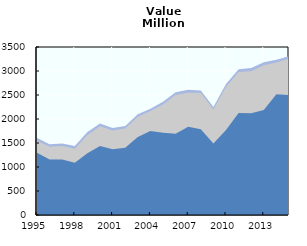
| Category | Inland fisheries | Aquaculture | Marine landings |
|---|---|---|---|
| 1995.0 | 1604.711 | 1547.007 | 1297.856 |
| 1996.0 | 1476.109 | 1424.082 | 1158.258 |
| 1997.0 | 1490.675 | 1438.333 | 1155.212 |
| 1998.0 | 1438.422 | 1380.849 | 1086.364 |
| 1999.0 | 1727.395 | 1668.109 | 1285.863 |
| 2000.0 | 1907.046 | 1849.504 | 1439.512 |
| 2001.0 | 1810.872 | 1759.281 | 1368.239 |
| 2002.0 | 1854.735 | 1800.192 | 1399.999 |
| 2003.0 | 2100.584 | 2049.431 | 1627.407 |
| 2004.0 | 2214.512 | 2165.262 | 1749.189 |
| 2005.0 | 2359.234 | 2304.262 | 1713.921 |
| 2006.0 | 2559.478 | 2498.515 | 1693.641 |
| 2007.0 | 2608.407 | 2548.213 | 1839.325 |
| 2008.0 | 2594.901 | 2539.547 | 1784.812 |
| 2009.0 | 2251.646 | 2200.32 | 1491.531 |
| 2010.0 | 2730.95 | 2672.161 | 1772.017 |
| 2011.0 | 3037.239 | 2978.392 | 2122.989 |
| 2012.0 | 3061.925 | 2994.534 | 2122.253 |
| 2013.0 | 3180.386 | 3121.223 | 2185.891 |
| 2014.0 | 3235.543 | 3178.559 | 2514.692 |
| 2015.0 | 3307.327 | 3257.128 | 2500.294 |